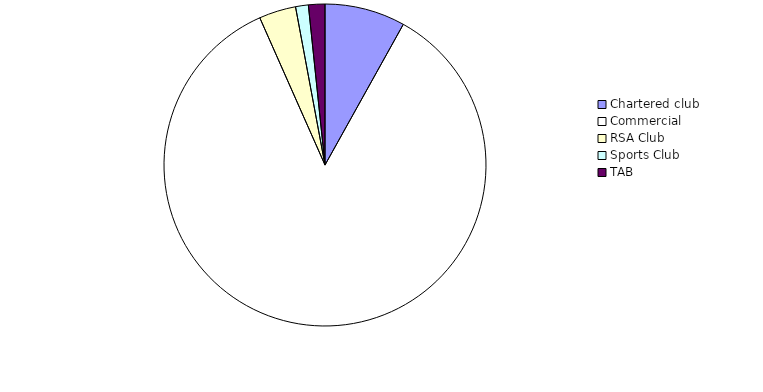
| Category | Series 0 |
|---|---|
| Chartered club | 17796515.68 |
| Commercial | 187706217.2 |
| RSA Club  | 8154792.14 |
| Sports Club | 2819424.27 |
| TAB | 3636246.4 |